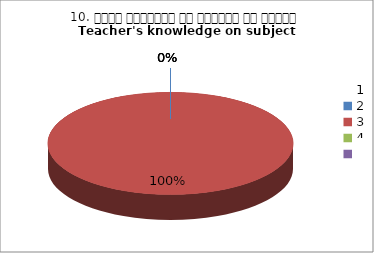
| Category | 10. विषय अवधारणा पर शिक्षक का ज्ञान
Teacher's knowledge on subject concept?
 |
|---|---|
| 0 | 0 |
| 1 | 1 |
| 2 | 0 |
| 3 | 0 |
| 4 | 0 |